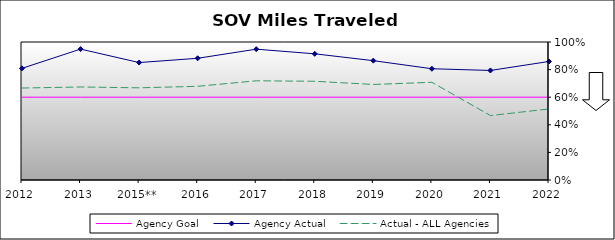
| Category | Agency Goal | Agency Actual | Actual - ALL Agencies |
|---|---|---|---|
| 2012 | 0.6 | 0.809 | 0.666 |
| 2013 | 0.6 | 0.948 | 0.674 |
| 2015** | 0.6 | 0.851 | 0.668 |
| 2016 | 0.6 | 0.882 | 0.679 |
| 2017 | 0.6 | 0.948 | 0.719 |
| 2018 | 0.6 | 0.914 | 0.715 |
| 2019 | 0.6 | 0.865 | 0.692 |
| 2020 | 0.6 | 0.806 | 0.708 |
| 2021 | 0.6 | 0.794 | 0.467 |
| 2022 | 0.6 | 0.859 | 0.515 |